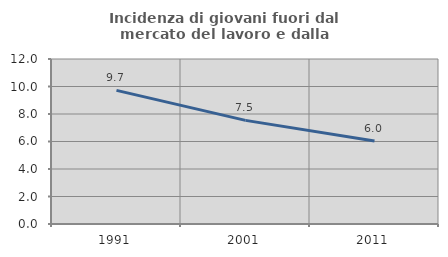
| Category | Incidenza di giovani fuori dal mercato del lavoro e dalla formazione  |
|---|---|
| 1991.0 | 9.717 |
| 2001.0 | 7.538 |
| 2011.0 | 6.03 |